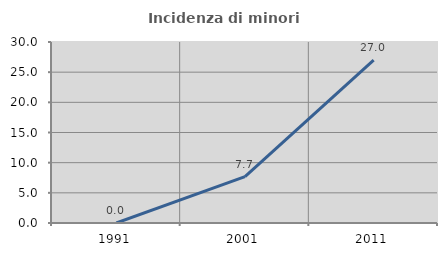
| Category | Incidenza di minori stranieri |
|---|---|
| 1991.0 | 0 |
| 2001.0 | 7.692 |
| 2011.0 | 27.007 |